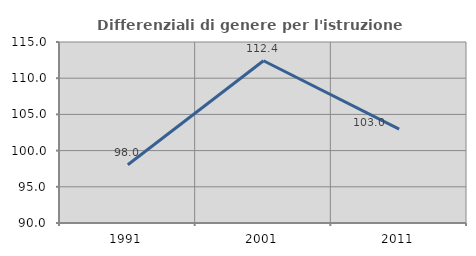
| Category | Differenziali di genere per l'istruzione superiore |
|---|---|
| 1991.0 | 98.046 |
| 2001.0 | 112.411 |
| 2011.0 | 102.968 |